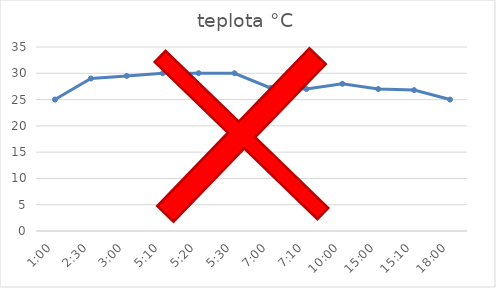
| Category | teplota °C |
|---|---|
| 0.041666666666666664 | 25 |
| 0.10416666666666667 | 29 |
| 0.125 | 29.5 |
| 0.2152777777777778 | 30 |
| 0.2222222222222222 | 30.02 |
| 0.22916666666666666 | 30 |
| 0.2916666666666667 | 27.2 |
| 0.2986111111111111 | 27 |
| 0.4166666666666667 | 28 |
| 0.625 | 27 |
| 0.6319444444444444 | 26.8 |
| 0.75 | 25 |